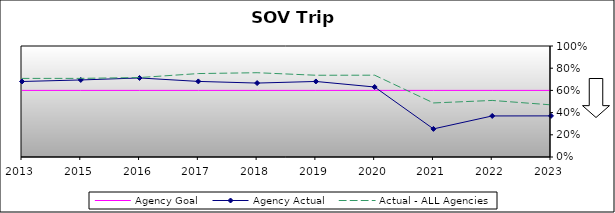
| Category | Agency Goal | Agency Actual | Actual - ALL Agencies |
|---|---|---|---|
| 2013.0 | 0.6 | 0.68 | 0.708 |
| 2015.0 | 0.6 | 0.694 | 0.708 |
| 2016.0 | 0.6 | 0.712 | 0.716 |
| 2017.0 | 0.6 | 0.681 | 0.752 |
| 2018.0 | 0.6 | 0.666 | 0.759 |
| 2019.0 | 0.6 | 0.681 | 0.736 |
| 2020.0 | 0.6 | 0.63 | 0.737 |
| 2021.0 | 0.6 | 0.253 | 0.487 |
| 2022.0 | 0.6 | 0.37 | 0.509 |
| 2023.0 | 0.6 | 0.37 | 0.47 |